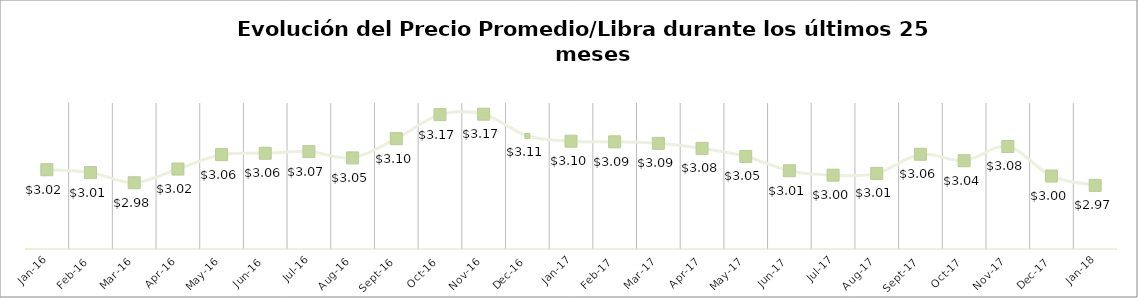
| Category | Series 1 |
|---|---|
| 2016-01-01 | 3.017 |
| 2016-02-01 | 3.009 |
| 2016-03-01 | 2.982 |
| 2016-04-01 | 3.019 |
| 2016-05-01 | 3.059 |
| 2016-06-01 | 3.062 |
| 2016-07-01 | 3.067 |
| 2016-08-01 | 3.05 |
| 2016-09-01 | 3.102 |
| 2016-10-01 | 3.168 |
| 2016-11-01 | 3.169 |
| 2016-12-01 | 3.11 |
| 2017-01-01 | 3.095 |
| 2017-02-01 | 3.094 |
| 2017-03-01 | 3.089 |
| 2017-04-01 | 3.076 |
| 2017-05-01 | 3.054 |
| 2017-06-01 | 3.014 |
| 2017-07-01 | 3.002 |
| 2017-08-01 | 3.007 |
| 2017-09-01 | 3.06 |
| 2017-10-01 | 3.042 |
| 2017-11-01 | 3.081 |
| 2017-12-01 | 3 |
| 2018-01-01 | 2.974 |